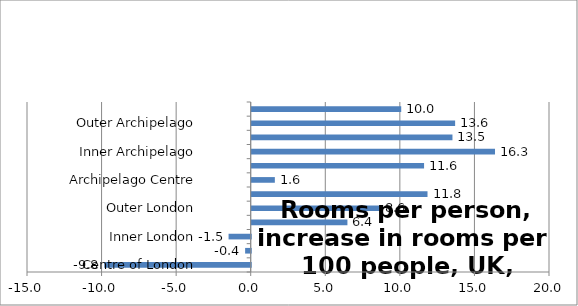
| Category | Series 0 |
|---|---|
| Centre of London | -9.822 |
| London Core | -0.375 |
| Inner London | -1.485 |
| London Suburbs | 6.417 |
| Outer London | 8.576 |
| London Edge | 11.787 |
| Archipelago Centre | 1.551 |
| Archipelago Core | 11.556 |
| Inner Archipelago | 16.313 |
| Archipelago Suburbs | 13.46 |
| Outer Archipelago | 13.639 |
| Archipelago Edge | 10.024 |